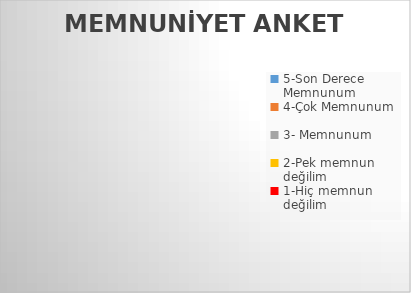
| Category | Series 0 |
|---|---|
| 5-Son Derece Memnunum | 0 |
| 4-Çok Memnunum | 0 |
| 3- Memnunum | 0 |
| 2-Pek memnun değilim | 0 |
| 1-Hiç memnun değilim | 0 |